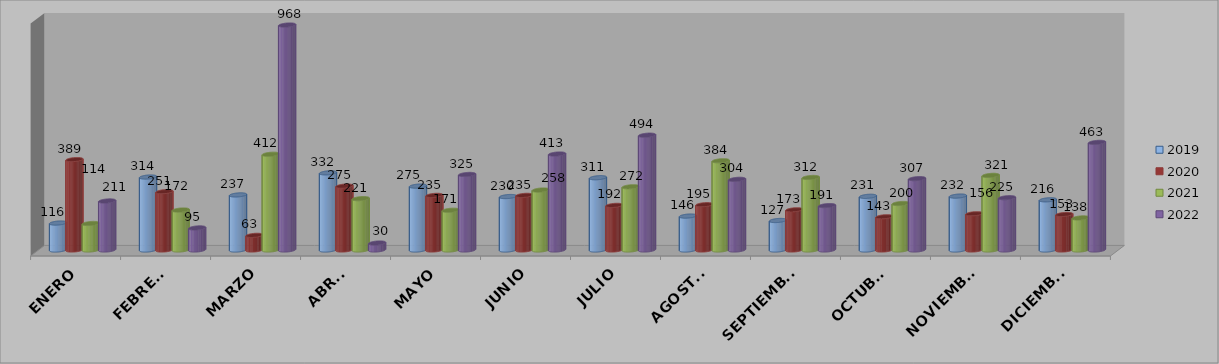
| Category | 2019 | 2020 | 2021 | 2022 |
|---|---|---|---|---|
| ENERO | 116 | 389 | 114 | 211 |
| FEBRERO | 314 | 251 | 172 | 95 |
| MARZO | 237 | 63 | 412 | 968 |
| ABRIL | 332 | 275 | 221 | 30 |
| MAYO | 275 | 235 | 171 | 325 |
| JUNIO | 230 | 235 | 258 | 413 |
| JULIO | 311 | 192 | 272 | 494 |
| AGOSTO | 146 | 195 | 384 | 304 |
| SEPTIEMBRE | 127 | 173 | 312 | 191 |
| OCTUBRE | 231 | 143 | 200 | 307 |
| NOVIEMBRE | 232 | 156 | 321 | 225 |
| DICIEMBRE | 216 | 153 | 138 | 463 |